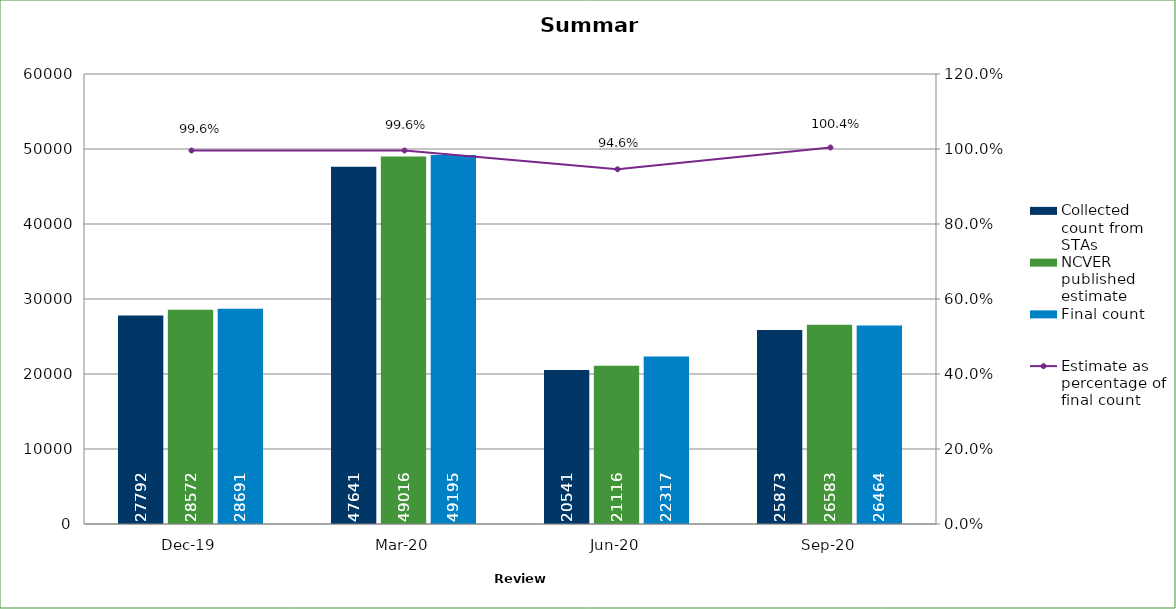
| Category | Collected count from STAs | NCVER published estimate  | Final count |
|---|---|---|---|
| 2019-12-01 | 27792 | 28572 | 28691 |
| 2020-03-01 | 47641 | 49016 | 49195 |
| 2020-06-01 | 20541 | 21116 | 22317 |
| 2020-09-01 | 25873 | 26583 | 26464 |